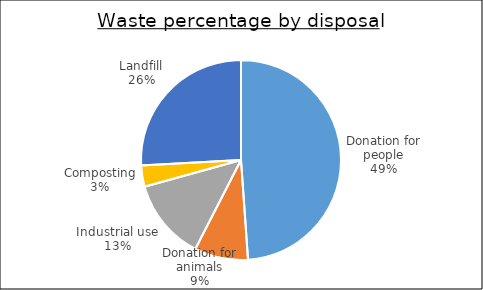
| Category | Series 0 |
|---|---|
| Donation for people | 3.27 |
| Donation for animals | 0.58 |
| Industrial use | 0.88 |
| Composting | 0.23 |
| Landfill | 1.73 |